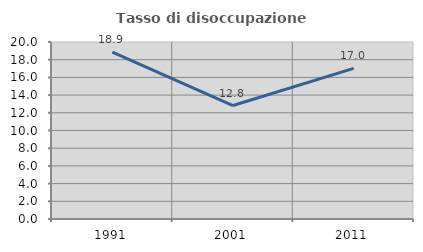
| Category | Tasso di disoccupazione giovanile  |
|---|---|
| 1991.0 | 18.868 |
| 2001.0 | 12.821 |
| 2011.0 | 17.021 |